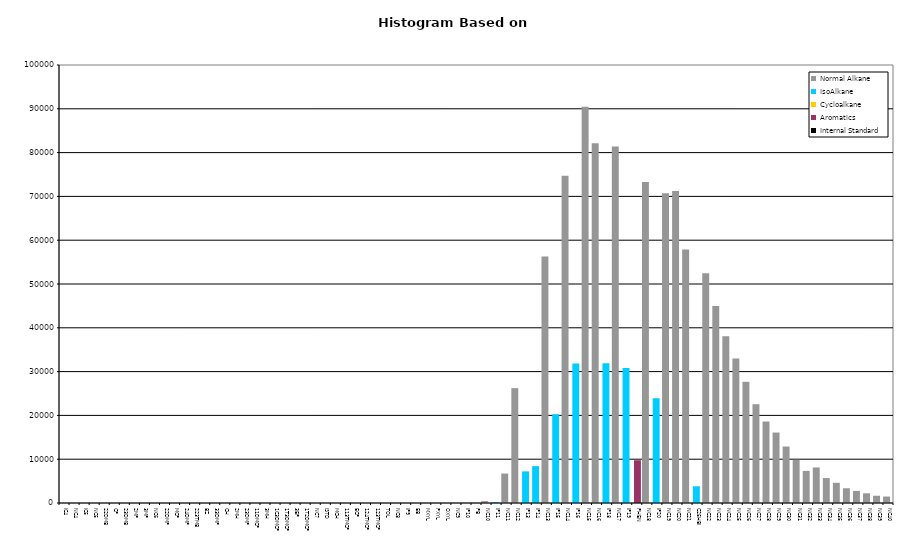
| Category | Normal Alkane | IsoAlkane | Cycloalkane | Aromatics | Internal Standard |
|---|---|---|---|---|---|
| IC4 | 0 | 0 | 0 | 0 | 0 |
| NC4 | 0 | 0 | 0 | 0 | 0 |
| IC5 | 0 | 0 | 0 | 0 | 0 |
| NC5 | 0 | 0 | 0 | 0 | 0 |
| 22DMB | 0 | 0 | 0 | 0 | 0 |
| CP | 0 | 0 | 0 | 0 | 0 |
| 23DMB | 0 | 0 | 0 | 0 | 0 |
| 2MP | 0 | 0 | 0 | 0 | 0 |
| 3MP | 0 | 0 | 0 | 0 | 0 |
| NC6 | 0 | 0 | 0 | 0 | 0 |
| 22DMP | 0 | 0 | 0 | 0 | 0 |
| MCP | 0 | 0 | 0 | 0 | 0 |
| 24DMP | 0 | 0 | 0 | 0 | 0 |
| 223TMB | 0 | 0 | 0 | 0 | 0 |
| BZ | 0 | 0 | 0 | 0 | 0 |
| 33DMP | 0 | 0 | 0 | 0 | 0 |
| CH | 0 | 0 | 0 | 0 | 0 |
| 2MH | 0 | 0 | 0 | 0 | 0 |
| 23DMP | 0 | 0 | 0 | 0 | 0 |
| 11DMCP | 0 | 0 | 0 | 0 | 0 |
| 3MH | 0 | 0 | 0 | 0 | 0 |
| 1C3DMCP | 0 | 0 | 0 | 0 | 0 |
| 1T3DMCP | 0 | 0 | 0 | 0 | 0 |
| 3EP | 0 | 0 | 0 | 0 | 0 |
| 1T2DMCP | 0 | 0 | 0 | 0 | 0 |
| NC7 | 0 | 0 | 0 | 0 | 0 |
| ISTD | 0 | 0 | 0 | 0 | 0 |
| MCH | 0 | 0 | 0 | 0 | 0 |
| 113TMCP | 0 | 0 | 0 | 0 | 0 |
| ECP | 0 | 0 | 0 | 0 | 0 |
| 124TMCP | 0 | 0 | 0 | 0 | 0 |
| 123TMCP | 0 | 0 | 0 | 0 | 0 |
| TOL | 0 | 0 | 0 | 0 | 0 |
| NC8 | 0 | 0 | 0 | 0 | 0 |
| IP9 | 0 | 0 | 0 | 0 | 0 |
| EB | 0 | 0 | 0 | 0 | 0 |
| MXYL | 0 | 0 | 0 | 0 | 0 |
| PXYL | 0 | 0 | 0 | 0 | 0 |
| OXYL | 0 | 0 | 0 | 0 | 0 |
| NC9 | 0 | 0 | 0 | 0 | 0 |
| IP10 | 0 | 0 | 0 | 0 | 0 |
| PB | 0 | 0 | 0 | 0 | 0 |
| NC10 | 435 | 0 | 0 | 0 | 0 |
| IP11 | 0 | 234 | 0 | 0 | 0 |
| NC11 | 6726 | 0 | 0 | 0 | 0 |
| NC12 | 26222 | 0 | 0 | 0 | 0 |
| IP13 | 0 | 7219 | 0 | 0 | 0 |
| IP14 | 0 | 8414 | 0 | 0 | 0 |
| NC13 | 56283 | 0 | 0 | 0 | 0 |
| IP15 | 0 | 20266 | 0 | 0 | 0 |
| NC14 | 74697 | 0 | 0 | 0 | 0 |
| IP16 | 0 | 31827 | 0 | 0 | 0 |
| NC15 | 90440 | 0 | 0 | 0 | 0 |
| NC16 | 82154 | 0 | 0 | 0 | 0 |
| IP18 | 0 | 31882 | 0 | 0 | 0 |
| NC17 | 81385 | 0 | 0 | 0 | 0 |
| IP19 | 0 | 30795 | 0 | 0 | 0 |
| PHEN | 0 | 0 | 0 | 9767 | 0 |
| NC18 | 73302 | 0 | 0 | 0 | 0 |
| IP20 | 0 | 23917 | 0 | 0 | 0 |
| NC19 | 70695 | 0 | 0 | 0 | 0 |
| NC20 | 71227 | 0 | 0 | 0 | 0 |
| NC21 | 57882 | 0 | 0 | 0 | 0 |
| C25HBI | 0 | 3821 | 0 | 0 | 0 |
| NC22 | 52448 | 0 | 0 | 0 | 0 |
| NC23 | 44999 | 0 | 0 | 0 | 0 |
| NC24 | 38068 | 0 | 0 | 0 | 0 |
| NC25 | 32980 | 0 | 0 | 0 | 0 |
| NC26 | 27669 | 0 | 0 | 0 | 0 |
| NC27 | 22551 | 0 | 0 | 0 | 0 |
| NC28 | 18599 | 0 | 0 | 0 | 0 |
| NC29 | 16086 | 0 | 0 | 0 | 0 |
| NC30 | 12892 | 0 | 0 | 0 | 0 |
| NC31 | 9863 | 0 | 0 | 0 | 0 |
| NC32 | 7333 | 0 | 0 | 0 | 0 |
| NC33 | 8117 | 0 | 0 | 0 | 0 |
| NC34 | 5688 | 0 | 0 | 0 | 0 |
| NC35 | 4608 | 0 | 0 | 0 | 0 |
| NC36 | 3367 | 0 | 0 | 0 | 0 |
| NC37 | 2758 | 0 | 0 | 0 | 0 |
| NC38 | 2215 | 0 | 0 | 0 | 0 |
| NC39 | 1656 | 0 | 0 | 0 | 0 |
| NC40 | 1475 | 0 | 0 | 0 | 0 |